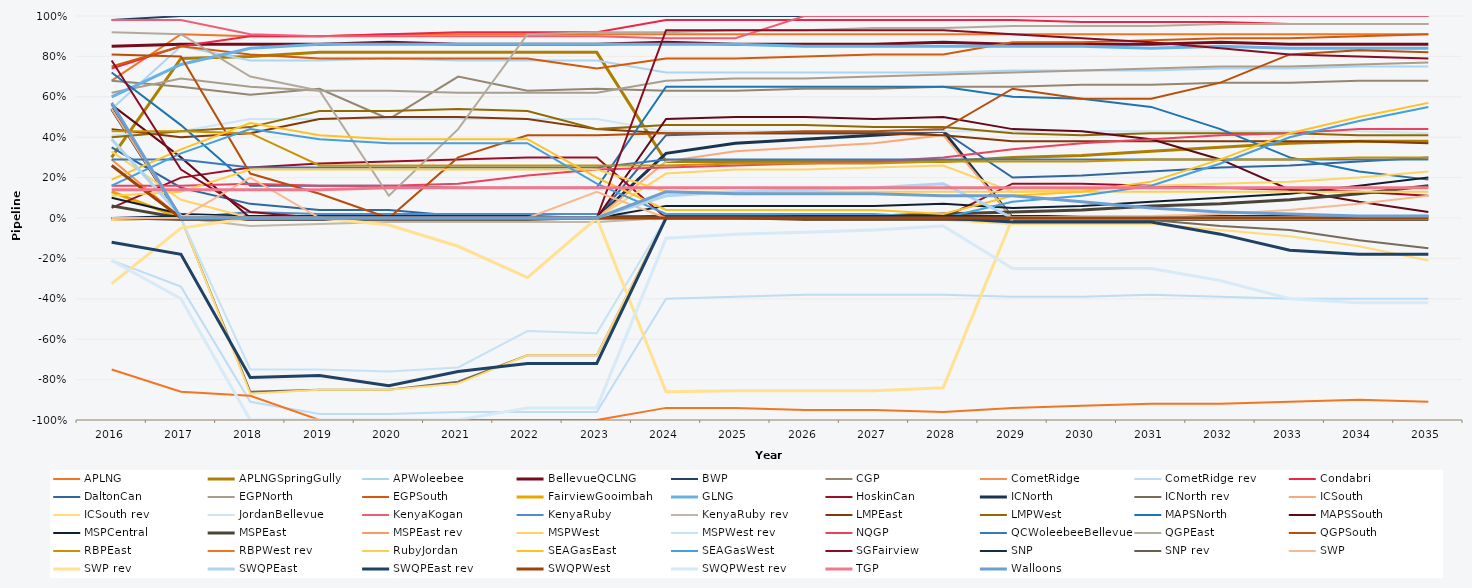
| Category | APLNG | APLNGSpringGully | APWoleebee | BellevueQCLNG | BWP | CGP | CometRidge | CometRidge rev | Condabri | DaltonCan | EGPNorth | EGPSouth | FairviewGooimbah | GLNG | HoskinCan | ICNorth | ICNorth rev | ICSouth | ICSouth rev | JordanBellevue | KenyaKogan | KenyaRuby | KenyaRuby rev | LMPEast | LMPWest | MAPSNorth | MAPSSouth | MSPCentral | MSPEast | MSPEast rev | MSPWest | MSPWest rev | NQGP | QCWoleebeeBellevue | QGPEast | QGPSouth | RBPEast | RBPWest rev | RubyJordan | SEAGasEast | SEAGasWest | SGFairview | SNP | SNP rev | SWP | SWP rev | SWQPEast | SWQPEast rev | SWQPWest | SWQPWest rev | TGP | Walloons |
|---|---|---|---|---|---|---|---|---|---|---|---|---|---|---|---|---|---|---|---|---|---|---|---|---|---|---|---|---|---|---|---|---|---|---|---|---|---|---|---|---|---|---|---|---|---|---|---|---|---|---|---|---|
| 2016.0 | 0.68 | 0.3 | 0.54 | 0.85 | 0.98 | 0.68 | 0.29 | -0.21 | 0.74 | 0.35 | 0.62 | 0.75 | 0.13 | 0.6 | 0.05 | 0.54 | -0.01 | 0.54 | -0.01 | 0.41 | 0.98 | 0 | 0 | 0.44 | 0.4 | 0.72 | 0.56 | 0.1 | 0.06 | 0 | 0.33 | 0 | 0.16 | 0.29 | 0.92 | 0.81 | 0.43 | -0.75 | 0.11 | 0.19 | 0.16 | 0.78 | 0 | 0 | 0 | -0.325 | 0.39 | -0.12 | 0.26 | -0.21 | 0.14 | 0.57 |
| 2017.0 | 0.91 | 0.79 | 0.85 | 0.86 | 1 | 0.65 | 0 | -0.34 | 0.85 | 0.15 | 0.69 | 0.85 | 0 | 0.76 | 0.2 | 0 | 0 | 0 | 0 | 0.43 | 0.98 | 0 | 0 | 0.4 | 0.43 | 0.46 | 0.3 | 0.02 | 0 | 0 | 0.09 | 0 | 0.16 | 0.29 | 0.91 | 0.8 | 0.43 | -0.86 | 0.13 | 0.34 | 0.32 | 0.24 | 0.01 | -0.01 | 0 | -0.05 | 0.01 | -0.18 | 0 | -0.4 | 0.14 | 0 |
| 2018.0 | 0.9 | 0.8 | 0.78 | 0.86 | 1 | 0.61 | 0 | -0.91 | 0.9 | 0.07 | 0.65 | 0.81 | 0 | 0.84 | 0.25 | 0 | -0.86 | 0 | -0.87 | 0.49 | 0.91 | 0.03 | -0.04 | 0.42 | 0.45 | 0.16 | 0 | 0.01 | 0 | 0 | 0 | -0.75 | 0.17 | 0.25 | 0.7 | 0.22 | 0.42 | -0.88 | 0.24 | 0.47 | 0.44 | 0.03 | 0 | -0.01 | 0.2 | 0 | 0 | -0.79 | 0 | -1 | 0.14 | 0 |
| 2019.0 | 0.9 | 0.82 | 0.78 | 0.86 | 1 | 0.64 | 0 | -0.97 | 0.9 | 0.04 | 0.63 | 0.79 | 0 | 0.86 | 0.27 | 0 | -0.85 | 0 | -0.85 | 0.49 | 0.9 | 0.02 | -0.03 | 0.49 | 0.53 | 0.16 | 0 | 0.01 | 0 | 0 | 0 | -0.75 | 0.16 | 0.25 | 0.63 | 0.12 | 0.26 | -1 | 0.24 | 0.41 | 0.39 | 0 | 0.01 | -0.01 | 0 | 0 | 0 | -0.78 | 0 | -1 | 0.14 | 0 |
| 2020.0 | 0.91 | 0.82 | 0.79 | 0.87 | 1 | 0.49 | 0 | -0.97 | 0.91 | 0.04 | 0.63 | 0.79 | 0 | 0.86 | 0.28 | 0 | -0.85 | 0 | -0.85 | 0.49 | 0.9 | 0.02 | -0.02 | 0.5 | 0.53 | 0.16 | 0 | 0 | 0 | 0 | 0 | -0.76 | 0.16 | 0.25 | 0.11 | 0 | 0.26 | -1 | 0.24 | 0.39 | 0.37 | 0 | 0.01 | -0.01 | 0 | -0.035 | 0 | -0.83 | 0 | -1 | 0.15 | 0 |
| 2021.0 | 0.91 | 0.82 | 0.78 | 0.86 | 1 | 0.7 | 0 | -0.96 | 0.92 | 0.01 | 0.62 | 0.79 | 0 | 0.86 | 0.29 | 0 | -0.81 | 0 | -0.82 | 0.49 | 0.9 | 0.02 | -0.02 | 0.5 | 0.54 | 0.15 | 0 | 0 | 0 | 0 | 0 | -0.74 | 0.17 | 0.25 | 0.44 | 0.3 | 0.26 | -1 | 0.24 | 0.39 | 0.37 | 0 | 0.01 | -0.01 | 0 | -0.14 | 0 | -0.76 | 0 | -1 | 0.15 | 0 |
| 2022.0 | 0.91 | 0.82 | 0.78 | 0.86 | 1 | 0.63 | 0 | -0.96 | 0.92 | 0 | 0.62 | 0.79 | 0 | 0.86 | 0.3 | 0 | -0.68 | 0 | -0.68 | 0.49 | 0.9 | 0.02 | -0.02 | 0.49 | 0.53 | 0.15 | 0 | 0 | 0 | 0 | 0 | -0.56 | 0.21 | 0.25 | 0.91 | 0.41 | 0.26 | -1 | 0.24 | 0.39 | 0.37 | 0 | 0.01 | -0.01 | 0 | -0.295 | 0 | -0.72 | 0 | -0.94 | 0.15 | 0 |
| 2023.0 | 0.91 | 0.82 | 0.78 | 0.86 | 1 | 0.64 | 0 | -0.96 | 0.92 | 0 | 0.62 | 0.74 | 0 | 0.86 | 0.3 | 0 | -0.68 | 0 | -0.68 | 0.49 | 0.9 | 0.02 | -0.02 | 0.44 | 0.44 | 0.15 | 0 | 0 | 0 | 0 | 0 | -0.57 | 0.24 | 0.25 | 0.92 | 0.41 | 0.26 | -1 | 0.24 | 0.2 | 0.17 | 0 | 0 | 0 | 0.13 | 0 | 0 | -0.72 | 0 | -0.94 | 0.15 | 0 |
| 2024.0 | 0.91 | 0.28 | 0.72 | 0.87 | 1 | 0.63 | 0 | -0.4 | 0.98 | 0.41 | 0.68 | 0.79 | 0 | 0.86 | 0 | 0.32 | 0 | 0.28 | 0 | 0.43 | 0.89 | 0 | 0 | 0.42 | 0.46 | 0.65 | 0.49 | 0.06 | 0.01 | 0 | 0.22 | 0 | 0.25 | 0.29 | 0.92 | 0.42 | 0.26 | -0.94 | 0.13 | 0.04 | 0.02 | 0.93 | 0 | 0 | 0 | -0.86 | 0.11 | 0 | 0 | -0.1 | 0.15 | 0.13 |
| 2025.0 | 0.91 | 0.28 | 0.72 | 0.86 | 1 | 0.63 | 0 | -0.39 | 0.98 | 0.42 | 0.69 | 0.79 | 0 | 0.86 | 0 | 0.37 | 0 | 0.33 | 0 | 0.43 | 0.89 | 0 | 0 | 0.42 | 0.46 | 0.65 | 0.5 | 0.06 | 0.01 | 0 | 0.24 | 0 | 0.26 | 0.29 | 0.93 | 0.42 | 0.27 | -0.94 | 0.13 | 0.04 | 0.02 | 0.93 | 0 | 0 | 0 | -0.855 | 0.13 | 0 | 0 | -0.08 | 0.15 | 0.12 |
| 2026.0 | 0.91 | 0.28 | 0.72 | 0.86 | 1 | 0.64 | 0 | -0.38 | 0.98 | 0.42 | 0.69 | 0.8 | 0 | 0.85 | 0 | 0.39 | 0 | 0.35 | 0 | 0.43 | 1 | 0 | 0 | 0.42 | 0.46 | 0.65 | 0.5 | 0.06 | 0.01 | 0 | 0.24 | 0 | 0.27 | 0.29 | 0.93 | 0.43 | 0.27 | -0.95 | 0.13 | 0.04 | 0.02 | 0.93 | 0.01 | -0.01 | 0 | -0.855 | 0.14 | 0 | 0 | -0.07 | 0.15 | 0.12 |
| 2027.0 | 0.91 | 0.28 | 0.72 | 0.86 | 1 | 0.64 | 0 | -0.38 | 0.98 | 0.42 | 0.7 | 0.81 | 0 | 0.85 | 0 | 0.41 | 0 | 0.37 | 0 | 0.43 | 1 | 0 | 0 | 0.42 | 0.45 | 0.65 | 0.49 | 0.06 | 0.01 | 0 | 0.25 | 0 | 0.28 | 0.29 | 0.94 | 0.43 | 0.27 | -0.95 | 0.13 | 0.04 | 0.02 | 0.93 | 0.01 | -0.01 | 0 | -0.855 | 0.15 | 0 | 0 | -0.06 | 0.15 | 0.12 |
| 2028.0 | 0.91 | 0.28 | 0.72 | 0.87 | 1 | 0.65 | 0 | -0.38 | 0.98 | 0.43 | 0.71 | 0.81 | 0 | 0.85 | 0 | 0.43 | 0 | 0.41 | -0.01 | 0.43 | 1 | 0 | 0 | 0.41 | 0.45 | 0.65 | 0.5 | 0.07 | 0.02 | 0 | 0.26 | 0 | 0.3 | 0.29 | 0.94 | 0.44 | 0.28 | -0.96 | 0.13 | 0.02 | 0 | 0.93 | 0.01 | -0.01 | 0 | -0.84 | 0.17 | 0 | 0 | -0.04 | 0.15 | 0.11 |
| 2029.0 | 0.91 | 0.3 | 0.73 | 0.86 | 1 | 0.65 | 0 | -0.39 | 0.98 | 0.2 | 0.72 | 0.87 | 0 | 0.85 | 0.17 | 0 | 0 | 0 | -0.03 | 0.43 | 1 | 0 | 0 | 0.38 | 0.42 | 0.6 | 0.44 | 0.05 | 0.03 | 0 | 0.13 | 0 | 0.34 | 0.29 | 0.95 | 0.64 | 0.28 | -0.94 | 0.13 | 0.11 | 0.08 | 0.91 | 0.01 | -0.01 | 0 | 0 | 0 | -0.02 | 0 | -0.25 | 0.15 | 0.11 |
| 2030.0 | 0.91 | 0.31 | 0.73 | 0.86 | 1 | 0.66 | 0 | -0.39 | 0.97 | 0.21 | 0.73 | 0.87 | 0 | 0.85 | 0.17 | 0 | 0 | 0 | -0.03 | 0.43 | 1 | 0 | 0 | 0.38 | 0.41 | 0.59 | 0.43 | 0.06 | 0.04 | 0 | 0.14 | 0 | 0.37 | 0.29 | 0.95 | 0.59 | 0.28 | -0.93 | 0.13 | 0.13 | 0.11 | 0.89 | 0.01 | -0.01 | 0.01 | 0 | 0 | -0.02 | 0 | -0.25 | 0.15 | 0.08 |
| 2031.0 | 0.91 | 0.33 | 0.73 | 0.86 | 1 | 0.66 | 0 | -0.38 | 0.97 | 0.23 | 0.74 | 0.88 | 0 | 0.84 | 0.16 | 0 | -0.01 | 0 | -0.03 | 0.43 | 1 | 0 | 0 | 0.38 | 0.42 | 0.55 | 0.39 | 0.08 | 0.06 | 0 | 0.16 | 0 | 0.39 | 0.29 | 0.95 | 0.59 | 0.29 | -0.92 | 0.13 | 0.18 | 0.16 | 0.87 | 0.01 | -0.01 | 0.01 | 0 | 0 | -0.02 | 0 | -0.25 | 0.15 | 0.05 |
| 2032.0 | 0.91 | 0.35 | 0.74 | 0.87 | 1 | 0.67 | 0 | -0.39 | 0.97 | 0.25 | 0.75 | 0.89 | 0 | 0.85 | 0.15 | 0 | -0.04 | 0 | -0.06 | 0.43 | 1 | 0 | 0 | 0.38 | 0.42 | 0.44 | 0.29 | 0.1 | 0.07 | 0 | 0.17 | 0 | 0.41 | 0.29 | 0.96 | 0.67 | 0.29 | -0.92 | 0.13 | 0.29 | 0.27 | 0.84 | 0.01 | -0.01 | 0.02 | 0 | 0 | -0.08 | 0 | -0.31 | 0.15 | 0.03 |
| 2033.0 | 0.91 | 0.37 | 0.74 | 0.86 | 1 | 0.67 | 0 | -0.4 | 0.96 | 0.26 | 0.75 | 0.89 | 0 | 0.84 | 0.14 | 0 | -0.06 | 0 | -0.09 | 0.43 | 1 | 0 | 0 | 0.38 | 0.42 | 0.3 | 0.14 | 0.12 | 0.09 | 0 | 0.18 | 0 | 0.42 | 0.29 | 0.96 | 0.81 | 0.29 | -0.91 | 0.13 | 0.42 | 0.4 | 0.81 | 0.01 | -0.01 | 0.04 | 0 | 0 | -0.16 | 0 | -0.4 | 0.15 | 0.02 |
| 2034.0 | 0.91 | 0.38 | 0.75 | 0.86 | 1 | 0.68 | 0 | -0.4 | 0.96 | 0.28 | 0.76 | 0.9 | 0 | 0.84 | 0.13 | 0 | -0.11 | 0 | -0.14 | 0.43 | 1 | 0 | 0 | 0.38 | 0.41 | 0.23 | 0.08 | 0.16 | 0.12 | 0 | 0.2 | 0 | 0.44 | 0.29 | 0.96 | 0.83 | 0.3 | -0.9 | 0.13 | 0.5 | 0.48 | 0.8 | 0.01 | -0.01 | 0.07 | 0 | 0 | -0.18 | 0 | -0.42 | 0.15 | 0.01 |
| 2035.0 | 0.91 | 0.38 | 0.75 | 0.86 | 1 | 0.68 | 0 | -0.4 | 0.96 | 0.3 | 0.77 | 0.91 | 0 | 0.84 | 0.11 | 0 | -0.15 | 0 | -0.21 | 0.42 | 1 | 0 | 0 | 0.37 | 0.41 | 0.19 | 0.03 | 0.2 | 0.16 | 0 | 0.23 | 0 | 0.44 | 0.29 | 0.96 | 0.82 | 0.3 | -0.91 | 0.13 | 0.57 | 0.55 | 0.79 | 0.01 | -0.01 | 0.11 | 0 | 0.01 | -0.18 | 0 | -0.42 | 0.15 | 0.01 |